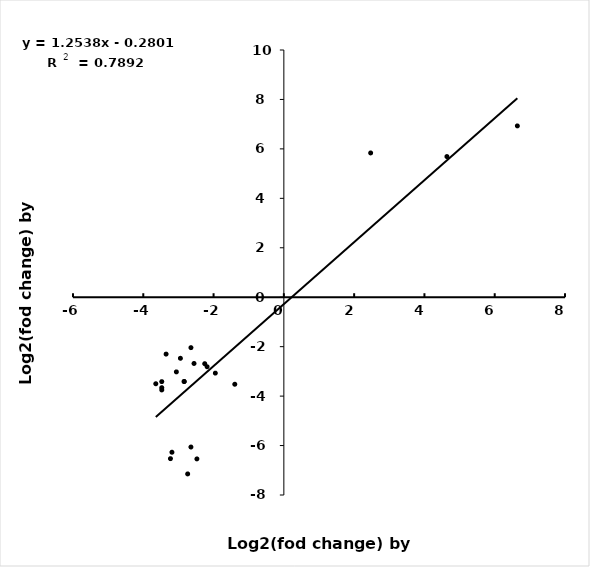
| Category | RNA-Seq |
|---|---|
| -1.95 | -3.07 |
| 2.47 | 5.835 |
| -3.22650852980868 | -6.53 |
| 6.643856189774725 | 6.93 |
| 4.64 | 5.69 |
| -2.2515387669959646 | -2.689 |
| -2.8365012677171206 | -3.41 |
| -2.1844245711374275 | -2.811 |
| -3.4739311883324127 | -3.414 |
| -3.4739311883324127 | -3.751 |
| -2.736965594166206 | -7.148 |
| -2.8365012677171206 | -3.41 |
| -2.473931188332412 | -6.54 |
| -2.643856189774725 | -2.04 |
| -2.643856189774725 | -6.06 |
| -3.6438561897747253 | -3.5 |
| -1.3959286763311392 | -3.52 |
| -2.5563933485243853 | -2.68 |
| -2.9434164716336326 | -2.47 |
| -3.0588936890535687 | -3.02 |
| -3.1844245711374275 | -6.27 |
| -3.3510744405468786 | -2.3 |
| -3.4739311883324127 | -3.66 |